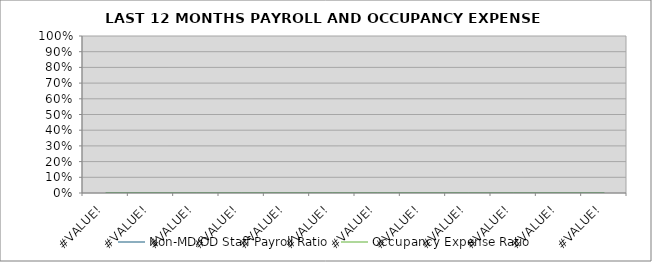
| Category | Non-MD/OD Staff Payroll Ratio | Occupancy Expense Ratio |
|---|---|---|
| 0.0 | 0 | 0 |
| 0.0 | 0 | 0 |
| 0.0 | 0 | 0 |
| 0.0 | 0 | 0 |
| 0.0 | 0 | 0 |
| 0.0 | 0 | 0 |
| 0.0 | 0 | 0 |
| 0.0 | 0 | 0 |
| 0.0 | 0 | 0 |
| 0.0 | 0 | 0 |
| 0.0 | 0 | 0 |
| 0.0 | 0 | 0 |